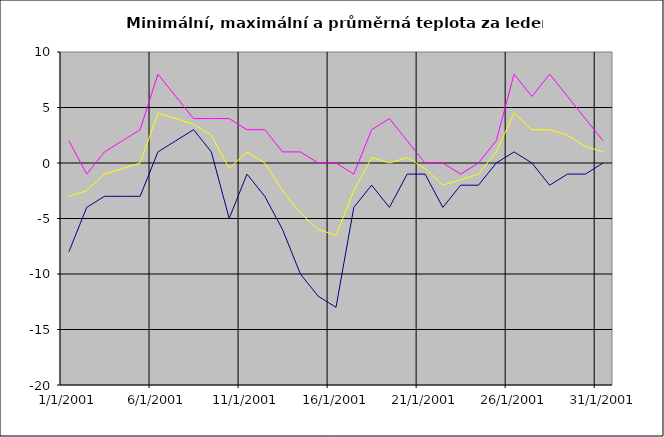
| Category | Series 0 | Series 1 | Series 2 |
|---|---|---|---|
| 2001-01-01 | -8 | 2 | -3 |
| 2001-01-02 | -4 | -1 | -2.5 |
| 2001-01-03 | -3 | 1 | -1 |
| 2001-01-04 | -3 | 2 | -0.5 |
| 2001-01-05 | -3 | 3 | 0 |
| 2001-01-06 | 1 | 8 | 4.5 |
| 2001-01-07 | 2 | 6 | 4 |
| 2001-01-08 | 3 | 4 | 3.5 |
| 2001-01-09 | 1 | 4 | 2.5 |
| 2001-01-10 | -5 | 4 | -0.5 |
| 2001-01-11 | -1 | 3 | 1 |
| 2001-01-12 | -3 | 3 | 0 |
| 2001-01-13 | -6 | 1 | -2.5 |
| 2001-01-14 | -10 | 1 | -4.5 |
| 2001-01-15 | -12 | 0 | -6 |
| 2001-01-16 | -13 | 0 | -6.5 |
| 2001-01-17 | -4 | -1 | -2.5 |
| 2001-01-18 | -2 | 3 | 0.5 |
| 2001-01-19 | -4 | 4 | 0 |
| 2001-01-20 | -1 | 2 | 0.5 |
| 2001-01-21 | -1 | 0 | -0.5 |
| 2001-01-22 | -4 | 0 | -2 |
| 2001-01-23 | -2 | -1 | -1.5 |
| 2001-01-24 | -2 | 0 | -1 |
| 2001-01-25 | 0 | 2 | 1 |
| 2001-01-26 | 1 | 8 | 4.5 |
| 2001-01-27 | 0 | 6 | 3 |
| 2001-01-28 | -2 | 8 | 3 |
| 2001-01-29 | -1 | 6 | 2.5 |
| 2001-01-30 | -1 | 4 | 1.5 |
| 2001-01-31 | 0 | 2 | 1 |